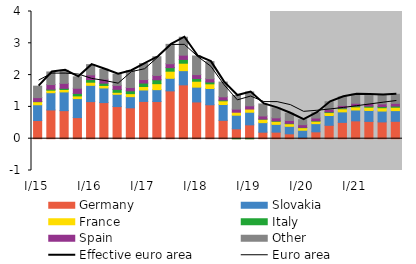
| Category | Germany | Slovakia | France | Italy | Spain | Other |
|---|---|---|---|---|---|---|
| I/15 | 0.571 | 0.497 | 0.095 | 0.009 | 0.12 | 0.36 |
| II | 0.904 | 0.542 | 0.079 | 0.032 | 0.146 | 0.396 |
| III | 0.882 | 0.589 | 0.075 | 0.038 | 0.156 | 0.411 |
| IV | 0.663 | 0.598 | 0.085 | 0.078 | 0.163 | 0.359 |
| I/16 | 1.166 | 0.512 | 0.098 | 0.084 | 0.147 | 0.321 |
| II | 1.136 | 0.46 | 0.079 | 0.072 | 0.123 | 0.316 |
| III | 1.01 | 0.386 | 0.063 | 0.094 | 0.125 | 0.354 |
| IV | 0.971 | 0.351 | 0.095 | 0.088 | 0.105 | 0.528 |
| I/17 | 1.172 | 0.36 | 0.11 | 0.108 | 0.11 | 0.503 |
| II | 1.169 | 0.374 | 0.188 | 0.122 | 0.138 | 0.586 |
| III | 1.504 | 0.395 | 0.224 | 0.111 | 0.123 | 0.609 |
| IV | 1.693 | 0.447 | 0.234 | 0.12 | 0.134 | 0.564 |
| I/18 | 1.156 | 0.466 | 0.186 | 0.087 | 0.121 | 0.586 |
| II | 1.067 | 0.512 | 0.147 | 0.058 | 0.102 | 0.538 |
| III | 0.577 | 0.498 | 0.116 | 0.025 | 0.101 | 0.463 |
| IV | 0.311 | 0.428 | 0.093 | -0.003 | 0.098 | 0.429 |
| I/19 | 0.436 | 0.397 | 0.1 | -0.003 | 0.103 | 0.434 |
| II | 0.205 | 0.3 | 0.108 | 0.006 | 0.097 | 0.377 |
| III | 0.206 | 0.245 | 0.096 | 0.014 | 0.095 | 0.313 |
| IV | 0.153 | 0.237 | 0.081 | 0.014 | 0.09 | 0.226 |
| I/20 | 0.037 | 0.229 | 0.08 | 0.01 | 0.085 | 0.156 |
| II | 0.216 | 0.258 | 0.079 | 0.013 | 0.084 | 0.167 |
| III | 0.422 | 0.308 | 0.092 | 0.021 | 0.081 | 0.238 |
| IV | 0.513 | 0.331 | 0.097 | 0.027 | 0.08 | 0.269 |
| I/21 | 0.561 | 0.341 | 0.099 | 0.033 | 0.079 | 0.286 |
| II | 0.544 | 0.344 | 0.101 | 0.035 | 0.082 | 0.285 |
| III | 0.528 | 0.341 | 0.104 | 0.036 | 0.085 | 0.282 |
| IV | 0.547 | 0.336 | 0.107 | 0.037 | 0.085 | 0.286 |